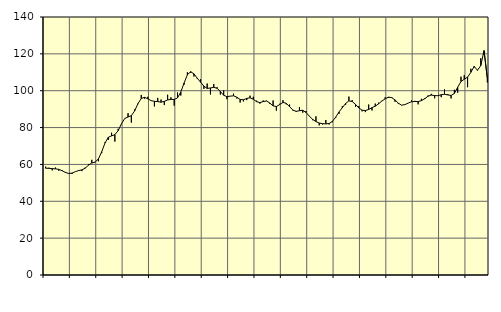
| Category | Piggar | Series 1 |
|---|---|---|
| nan | 58.8 | 57.93 |
| 87.0 | 58.2 | 57.89 |
| 87.0 | 56.8 | 57.73 |
| 87.0 | 58.3 | 57.58 |
| nan | 56.6 | 57.33 |
| 88.0 | 56.9 | 56.59 |
| 88.0 | 55.9 | 55.66 |
| 88.0 | 54.9 | 55.1 |
| nan | 54.8 | 55.29 |
| 89.0 | 56.1 | 56.08 |
| 89.0 | 56.8 | 56.66 |
| 89.0 | 56.4 | 57.04 |
| nan | 58.3 | 57.99 |
| 90.0 | 60.1 | 59.6 |
| 90.0 | 62.5 | 60.78 |
| 90.0 | 61.4 | 61.25 |
| nan | 61.7 | 62.96 |
| 91.0 | 66.1 | 66.83 |
| 91.0 | 72 | 71.6 |
| 91.0 | 73.3 | 74.73 |
| nan | 77.2 | 75.5 |
| 92.0 | 72.4 | 76.16 |
| 92.0 | 79.3 | 78.32 |
| 92.0 | 81.9 | 82.06 |
| nan | 85.1 | 84.96 |
| 93.0 | 87.8 | 85.74 |
| 93.0 | 82.7 | 86.49 |
| 93.0 | 89.9 | 89.05 |
| nan | 92.7 | 92.99 |
| 94.0 | 97.7 | 95.79 |
| 94.0 | 95.7 | 96.39 |
| 94.0 | 96.7 | 95.63 |
| nan | 94.5 | 94.61 |
| 95.0 | 91.5 | 94.24 |
| 95.0 | 96.1 | 94.09 |
| 95.0 | 95.2 | 93.77 |
| nan | 92.2 | 94.2 |
| 96.0 | 97.8 | 94.99 |
| 96.0 | 96.4 | 95.29 |
| 96.0 | 91.9 | 95.28 |
| nan | 99 | 96.09 |
| 97.0 | 97.4 | 99.31 |
| 97.0 | 103.3 | 104.17 |
| 97.0 | 110 | 108.63 |
| nan | 109.7 | 110.35 |
| 98.0 | 107.7 | 109.13 |
| 98.0 | 106.4 | 106.79 |
| 98.0 | 106.2 | 104.64 |
| nan | 101 | 102.52 |
| 99.0 | 103.9 | 101.23 |
| 99.0 | 98 | 101.5 |
| 99.0 | 103.6 | 101.84 |
| nan | 101.9 | 101.31 |
| 0.0 | 97.9 | 99.6 |
| 0.0 | 100.2 | 97.54 |
| 0.0 | 95.4 | 96.78 |
| nan | 97 | 97.06 |
| 1.0 | 98.4 | 97.23 |
| 1.0 | 95.8 | 96.47 |
| 1.0 | 93.6 | 95.25 |
| nan | 94.2 | 95.08 |
| 2.0 | 94.9 | 95.82 |
| 2.0 | 97.3 | 96.18 |
| 2.0 | 96.7 | 95.35 |
| nan | 94.6 | 94.05 |
| 3.0 | 93 | 93.55 |
| 3.0 | 94.7 | 94.12 |
| 3.0 | 94.6 | 94.42 |
| nan | 92.9 | 93.32 |
| 4.0 | 94.7 | 91.77 |
| 4.0 | 89.2 | 91.4 |
| 4.0 | 92.9 | 92.51 |
| nan | 94.9 | 93.64 |
| 5.0 | 92.6 | 93.18 |
| 5.0 | 92.5 | 91.31 |
| 5.0 | 89.3 | 89.53 |
| nan | 88.5 | 88.79 |
| 6.0 | 91.1 | 89.14 |
| 6.0 | 88.1 | 89.38 |
| 6.0 | 89 | 88.2 |
| nan | 86.1 | 86.19 |
| 7.0 | 84 | 84.46 |
| 7.0 | 86.1 | 83.27 |
| 7.0 | 81.2 | 82.46 |
| nan | 81.7 | 82.11 |
| 8.0 | 84.1 | 82 |
| 8.0 | 81.7 | 82.21 |
| 8.0 | 82.9 | 83.34 |
| nan | 85.3 | 85.69 |
| 9.0 | 87.5 | 88.5 |
| 9.0 | 91.6 | 90.8 |
| 9.0 | 92.4 | 93.07 |
| nan | 96.8 | 94.49 |
| 10.0 | 94.9 | 94.14 |
| 10.0 | 91.3 | 92.6 |
| 10.0 | 91.6 | 90.67 |
| nan | 88.8 | 89.42 |
| 11.0 | 88.4 | 89.24 |
| 11.0 | 92.5 | 89.82 |
| 11.0 | 89.3 | 90.81 |
| nan | 93 | 91.62 |
| 12.0 | 93.5 | 92.88 |
| 12.0 | 94.5 | 94.38 |
| 12.0 | 96.4 | 95.6 |
| nan | 96.1 | 96.51 |
| 13.0 | 96.5 | 96.24 |
| 13.0 | 94 | 95 |
| 13.0 | 92.8 | 93.23 |
| nan | 92.2 | 92.14 |
| 14.0 | 92.4 | 92.47 |
| 14.0 | 93.3 | 93.29 |
| 14.0 | 94.7 | 94.02 |
| nan | 94.5 | 94.15 |
| 15.0 | 92.6 | 94.13 |
| 15.0 | 95.6 | 94.6 |
| 15.0 | 96 | 95.65 |
| nan | 97.4 | 97.02 |
| 16.0 | 98.3 | 97.63 |
| 16.0 | 95.9 | 97.36 |
| 16.0 | 97.3 | 97.29 |
| nan | 96.5 | 97.82 |
| 17.0 | 100.7 | 98.08 |
| 17.0 | 98.2 | 97.71 |
| 17.0 | 95.8 | 97.41 |
| nan | 100.5 | 98.52 |
| 18.0 | 98.9 | 101.88 |
| 18.0 | 107.6 | 104.99 |
| 18.0 | 108.4 | 106.23 |
| nan | 101.9 | 107.35 |
| 19.0 | 111.9 | 110 |
| 19.0 | 112.6 | 113.22 |
| 19.0 | 110.9 | 111.1 |
| nan | 117.6 | 113.6 |
| 20.0 | 119.4 | 121.73 |
| 20.0 | 104.5 | 106.64 |